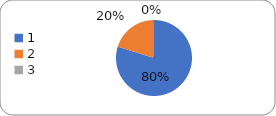
| Category | Series 0 |
|---|---|
| 0 | 91 |
| 1 | 23 |
| 2 | 0 |